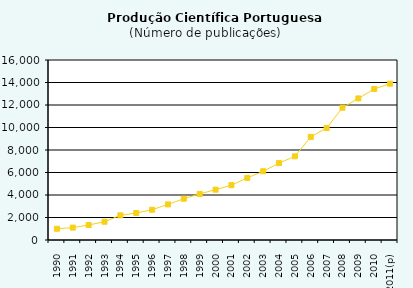
| Category | Total de publicações  |
|---|---|
| 1990 | 1001 |
| 1991 | 1101 |
| 1992 | 1333 |
| 1993 | 1624 |
| 1994 | 2193 |
| 1995 | 2400 |
| 1996 | 2691 |
| 1997 | 3165 |
| 1998 | 3668 |
| 1999 | 4097 |
| 2000 | 4474 |
| 2001 | 4872 |
| 2002 | 5523 |
| 2003 | 6111 |
| 2004 | 6835 |
| 2005 | 7437 |
| 2006 | 9166 |
| 2007 | 9952 |
| 2008 | 11759 |
| 2009 | 12584 |
| 2010 | 13424 |
| 2011(p) | 13897 |